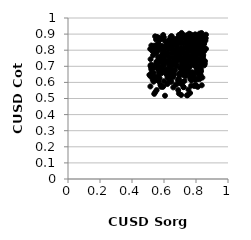
| Category | Series 0 |
|---|---|
| 0.5457226578914693 | 0.803 |
| 0.5820415566814895 | 0.742 |
| 0.6574451764975326 | 0.66 |
| 0.6752550594382059 | 0.869 |
| 0.7130549381380016 | 0.871 |
| 0.5505754176995341 | 0.783 |
| 0.7488513275881186 | 0.678 |
| 0.8416256582278505 | 0.766 |
| 0.723683260445533 | 0.812 |
| 0.7935257288644972 | 0.796 |
| 0.693018027354305 | 0.773 |
| 0.784467930927218 | 0.633 |
| 0.8117410290243743 | 0.855 |
| 0.6580849766439321 | 0.569 |
| 0.7692660674586399 | 0.764 |
| 0.6405592007420011 | 0.656 |
| 0.7277209901649628 | 0.609 |
| 0.7744196884114483 | 0.663 |
| 0.668613444816808 | 0.847 |
| 0.7392412906544054 | 0.71 |
| 0.689508161379329 | 0.594 |
| 0.731924884660142 | 0.868 |
| 0.8248937572480575 | 0.65 |
| 0.5148524658414562 | 0.575 |
| 0.5641696275729025 | 0.84 |
| 0.8037513007634838 | 0.578 |
| 0.7483759412593186 | 0.684 |
| 0.5663074692521712 | 0.694 |
| 0.5499941879436182 | 0.791 |
| 0.7121200630051845 | 0.712 |
| 0.7058212405791672 | 0.814 |
| 0.5937035099978996 | 0.717 |
| 0.8291260168941896 | 0.673 |
| 0.5570148817277782 | 0.882 |
| 0.7141468487834657 | 0.694 |
| 0.6580584887409366 | 0.633 |
| 0.6399307540311069 | 0.88 |
| 0.6925681058426278 | 0.877 |
| 0.7614702906040478 | 0.661 |
| 0.5578501910818092 | 0.728 |
| 0.5394427603922205 | 0.805 |
| 0.7743932370819626 | 0.647 |
| 0.7220183729899539 | 0.84 |
| 0.5455888965109581 | 0.54 |
| 0.7817488615426387 | 0.727 |
| 0.8150313525948676 | 0.652 |
| 0.5501655988925712 | 0.867 |
| 0.5779119782322806 | 0.806 |
| 0.8177974553196619 | 0.736 |
| 0.7369173507866649 | 0.764 |
| 0.5996876197299047 | 0.82 |
| 0.8232861234015729 | 0.691 |
| 0.5421583549383685 | 0.633 |
| 0.8203063983397311 | 0.628 |
| 0.7432944801690256 | 0.52 |
| 0.8026722654339411 | 0.747 |
| 0.7324021082682642 | 0.758 |
| 0.8232832348045411 | 0.829 |
| 0.5556463949286581 | 0.88 |
| 0.7620896380337474 | 0.705 |
| 0.6223724156518007 | 0.809 |
| 0.6401315556109933 | 0.829 |
| 0.8311983168125705 | 0.669 |
| 0.6127117955059027 | 0.823 |
| 0.6096722874639363 | 0.773 |
| 0.571638113350313 | 0.807 |
| 0.8207566657600132 | 0.862 |
| 0.6554024281387867 | 0.839 |
| 0.5907336533650455 | 0.876 |
| 0.6015353490839019 | 0.775 |
| 0.7043214704565222 | 0.754 |
| 0.7778187052440948 | 0.724 |
| 0.589962655403742 | 0.776 |
| 0.6125058261240378 | 0.826 |
| 0.6810460499648323 | 0.773 |
| 0.5351386777890065 | 0.604 |
| 0.7046044673771751 | 0.739 |
| 0.8560215062351673 | 0.732 |
| 0.8112118226193524 | 0.572 |
| 0.7696481851082584 | 0.579 |
| 0.73460007247253 | 0.646 |
| 0.8223389512555741 | 0.877 |
| 0.8090318014074852 | 0.619 |
| 0.7556542803738591 | 0.662 |
| 0.7200901535938342 | 0.754 |
| 0.6028327518208085 | 0.709 |
| 0.6498979735421571 | 0.804 |
| 0.8286975612409831 | 0.647 |
| 0.6349791255831567 | 0.64 |
| 0.8113693694834748 | 0.866 |
| 0.6089561161708308 | 0.726 |
| 0.8064496722266732 | 0.743 |
| 0.8414270815792777 | 0.836 |
| 0.5948114404613527 | 0.894 |
| 0.8351740172883895 | 0.749 |
| 0.8470185200196598 | 0.809 |
| 0.5286461403371234 | 0.793 |
| 0.836226499715456 | 0.77 |
| 0.7889180925463773 | 0.755 |
| 0.6964362518172005 | 0.742 |
| 0.704740798943889 | 0.753 |
| 0.6874071028220665 | 0.785 |
| 0.6327013951077701 | 0.713 |
| 0.6667462719494607 | 0.728 |
| 0.7718375700217853 | 0.799 |
| 0.5855870259741989 | 0.676 |
| 0.5994315803905712 | 0.88 |
| 0.6686731617542627 | 0.677 |
| 0.7056628581224103 | 0.684 |
| 0.8226938736839762 | 0.62 |
| 0.7991582025080584 | 0.758 |
| 0.6792116834227808 | 0.711 |
| 0.6097799660327874 | 0.853 |
| 0.7067010526190458 | 0.851 |
| 0.7880500071993324 | 0.817 |
| 0.6070274973598637 | 0.766 |
| 0.6797144303513258 | 0.731 |
| 0.8060280911832491 | 0.839 |
| 0.5944923998553302 | 0.573 |
| 0.7055036387190643 | 0.605 |
| 0.5167144154654271 | 0.636 |
| 0.7684431915546811 | 0.898 |
| 0.8301815004301825 | 0.685 |
| 0.7358644083941208 | 0.703 |
| 0.6355770242712496 | 0.864 |
| 0.5998937174973021 | 0.739 |
| 0.6610690526595713 | 0.804 |
| 0.5443224519067439 | 0.886 |
| 0.8250639963311653 | 0.669 |
| 0.6343441347901457 | 0.714 |
| 0.8542204190350994 | 0.719 |
| 0.8009249630894547 | 0.781 |
| 0.701712464511115 | 0.692 |
| 0.5968407545011762 | 0.866 |
| 0.8092134369510031 | 0.665 |
| 0.7751363434336973 | 0.84 |
| 0.7703977460090834 | 0.738 |
| 0.602412143621385 | 0.751 |
| 0.7293454715185994 | 0.712 |
| 0.7326885663684408 | 0.72 |
| 0.8519527553697637 | 0.706 |
| 0.74429664049625 | 0.811 |
| 0.6589718991559934 | 0.734 |
| 0.6074626190114201 | 0.73 |
| 0.7303092911457154 | 0.667 |
| 0.5316798145948454 | 0.769 |
| 0.8498805345270116 | 0.808 |
| 0.7037756386627636 | 0.662 |
| 0.6279858290744565 | 0.674 |
| 0.6306680831892935 | 0.732 |
| 0.7923426204302795 | 0.771 |
| 0.5783801617728314 | 0.728 |
| 0.8329304098219796 | 0.71 |
| 0.7157899061074547 | 0.707 |
| 0.6941806884987283 | 0.654 |
| 0.8140350888670429 | 0.848 |
| 0.7528574969121704 | 0.729 |
| 0.7289511681770138 | 0.706 |
| 0.6975802560361317 | 0.744 |
| 0.6545090825566181 | 0.861 |
| 0.5300046211152594 | 0.615 |
| 0.569470798504409 | 0.876 |
| 0.7923019704914944 | 0.706 |
| 0.7821448947220843 | 0.803 |
| 0.8240041782040589 | 0.648 |
| 0.6335262740235029 | 0.743 |
| 0.5382240039686249 | 0.779 |
| 0.7232030528612523 | 0.811 |
| 0.8398929430815486 | 0.63 |
| 0.6221200860546816 | 0.818 |
| 0.756617127246918 | 0.831 |
| 0.5619085718854187 | 0.806 |
| 0.6217228319325869 | 0.633 |
| 0.7891260018829774 | 0.578 |
| 0.7090840532613476 | 0.78 |
| 0.7295319007173267 | 0.787 |
| 0.5199076824365112 | 0.71 |
| 0.6633647408142589 | 0.843 |
| 0.7012200201920786 | 0.754 |
| 0.738580813105093 | 0.737 |
| 0.6181598579368397 | 0.731 |
| 0.5682464536808958 | 0.827 |
| 0.8208228289320129 | 0.69 |
| 0.8128115952784443 | 0.875 |
| 0.7990016938769943 | 0.859 |
| 0.7859702391100623 | 0.727 |
| 0.5933946993905561 | 0.704 |
| 0.5246550163250101 | 0.657 |
| 0.8504443894310971 | 0.838 |
| 0.717387376320967 | 0.797 |
| 0.5925338079033657 | 0.574 |
| 0.6544395240370471 | 0.754 |
| 0.7444861998617047 | 0.788 |
| 0.6062955457466427 | 0.517 |
| 0.8227783438375249 | 0.775 |
| 0.8115050081394497 | 0.801 |
| 0.639344223111258 | 0.693 |
| 0.6884022729648416 | 0.874 |
| 0.7932472437931712 | 0.871 |
| 0.6936436006363742 | 0.895 |
| 0.7351775159769071 | 0.739 |
| 0.6458138273778244 | 0.604 |
| 0.6795080404202227 | 0.836 |
| 0.7215914135102182 | 0.726 |
| 0.6932193575462688 | 0.531 |
| 0.6368434859051253 | 0.642 |
| 0.514160042493545 | 0.808 |
| 0.6576041158151178 | 0.723 |
| 0.7621335626045096 | 0.855 |
| 0.6508112078117776 | 0.781 |
| 0.8160065613895429 | 0.658 |
| 0.7100015617056175 | 0.812 |
| 0.7337705860979025 | 0.776 |
| 0.780740160797371 | 0.726 |
| 0.6907962252388742 | 0.786 |
| 0.6647489516856484 | 0.791 |
| 0.5086555845352292 | 0.646 |
| 0.5357004068542792 | 0.827 |
| 0.7504082187276574 | 0.697 |
| 0.7674915398347391 | 0.617 |
| 0.7636605590644167 | 0.625 |
| 0.6737516958858087 | 0.774 |
| 0.6767633985221474 | 0.7 |
| 0.518940205423245 | 0.698 |
| 0.5872910299345999 | 0.826 |
| 0.6963021674334908 | 0.895 |
| 0.5832067026063025 | 0.656 |
| 0.6030994791616044 | 0.814 |
| 0.5734271380362364 | 0.812 |
| 0.7859343229689043 | 0.657 |
| 0.7952599979824492 | 0.832 |
| 0.7629079511370483 | 0.534 |
| 0.5339597305756433 | 0.791 |
| 0.6394139486975694 | 0.836 |
| 0.6206743735486271 | 0.779 |
| 0.704649081712923 | 0.785 |
| 0.784640023093506 | 0.642 |
| 0.7966208826865359 | 0.586 |
| 0.7731501131860025 | 0.839 |
| 0.7709158109155311 | 0.885 |
| 0.7275372221889764 | 0.672 |
| 0.6728059831532607 | 0.764 |
| 0.7489849105715798 | 0.743 |
| 0.5991716594737471 | 0.805 |
| 0.6140034713718365 | 0.668 |
| 0.5729350254615874 | 0.626 |
| 0.7809462646204444 | 0.78 |
| 0.6131688486460309 | 0.653 |
| 0.5541262416540156 | 0.552 |
| 0.7590754828616135 | 0.735 |
| 0.7686598181268046 | 0.867 |
| 0.6145284328812132 | 0.654 |
| 0.5649471984021953 | 0.758 |
| 0.8154574342041097 | 0.804 |
| 0.7598321685517213 | 0.835 |
| 0.8024852557121498 | 0.694 |
| 0.7512012070861279 | 0.768 |
| 0.8484403197536137 | 0.859 |
| 0.8381324836891018 | 0.79 |
| 0.7902770328779133 | 0.76 |
| 0.8055053134197745 | 0.823 |
| 0.7573843003489542 | 0.903 |
| 0.7946716083134628 | 0.801 |
| 0.6563218226363332 | 0.674 |
| 0.7367507521972351 | 0.751 |
| 0.562991837771626 | 0.804 |
| 0.6377966499974312 | 0.753 |
| 0.534723215199524 | 0.659 |
| 0.8430780405204346 | 0.754 |
| 0.6146173753745332 | 0.848 |
| 0.8487587485391697 | 0.794 |
| 0.5388189035339608 | 0.807 |
| 0.7863585402357585 | 0.765 |
| 0.5484373544758774 | 0.83 |
| 0.8276881254261959 | 0.9 |
| 0.6261683226153498 | 0.762 |
| 0.5819251264557938 | 0.757 |
| 0.639377260748907 | 0.838 |
| 0.7419219571911421 | 0.893 |
| 0.6345557596136235 | 0.816 |
| 0.6209920211432634 | 0.59 |
| 0.8164304735037569 | 0.748 |
| 0.7052827385138507 | 0.842 |
| 0.8184236083612763 | 0.802 |
| 0.6857459586856993 | 0.78 |
| 0.5725995342829608 | 0.725 |
| 0.7484029003236523 | 0.693 |
| 0.7030485930250077 | 0.809 |
| 0.5347649882319792 | 0.69 |
| 0.83884792687884 | 0.764 |
| 0.7345890803913315 | 0.639 |
| 0.7226641959422739 | 0.571 |
| 0.7853798380852879 | 0.873 |
| 0.6067636700595906 | 0.735 |
| 0.7185031711311807 | 0.647 |
| 0.7515986636866785 | 0.811 |
| 0.7564218031383423 | 0.793 |
| 0.748161755578695 | 0.521 |
| 0.7202545400793892 | 0.895 |
| 0.5765384960217534 | 0.693 |
| 0.7893576199131072 | 0.807 |
| 0.704768664331455 | 0.848 |
| 0.6482495891239841 | 0.647 |
| 0.8219265795129762 | 0.812 |
| 0.7222598622249133 | 0.571 |
| 0.5881596806969869 | 0.758 |
| 0.6270958874658681 | 0.857 |
| 0.788833704724099 | 0.873 |
| 0.7386394748302694 | 0.857 |
| 0.8607986164784189 | 0.875 |
| 0.5471126083638143 | 0.712 |
| 0.7329926062301941 | 0.682 |
| 0.687914211849169 | 0.806 |
| 0.6859344851542606 | 0.764 |
| 0.7072568770247014 | 0.522 |
| 0.7524439383659012 | 0.555 |
| 0.595269876609414 | 0.702 |
| 0.648290209828648 | 0.782 |
| 0.8515110039284193 | 0.847 |
| 0.8221107040927301 | 0.748 |
| 0.632431793162139 | 0.605 |
| 0.5502608873071357 | 0.794 |
| 0.8086103625012645 | 0.802 |
| 0.7126590128747636 | 0.588 |
| 0.5776132802893417 | 0.585 |
| 0.6125268138490501 | 0.823 |
| 0.5460114812361078 | 0.615 |
| 0.7415865172290823 | 0.831 |
| 0.7276898966704057 | 0.76 |
| 0.756072999874384 | 0.797 |
| 0.6848773386886298 | 0.842 |
| 0.8623340319744193 | 0.896 |
| 0.8288662566513342 | 0.713 |
| 0.6862774990478859 | 0.614 |
| 0.5233252085184212 | 0.662 |
| 0.8384968472326244 | 0.73 |
| 0.6641857316615347 | 0.833 |
| 0.7517861152247981 | 0.878 |
| 0.8551685982709638 | 0.863 |
| 0.5619667239534007 | 0.702 |
| 0.5490399125217993 | 0.821 |
| 0.5877374580250732 | 0.691 |
| 0.6724643111528634 | 0.584 |
| 0.6878997740774873 | 0.798 |
| 0.8067732555838519 | 0.748 |
| 0.7785102826935196 | 0.79 |
| 0.6530151640653311 | 0.815 |
| 0.7322183510233999 | 0.76 |
| 0.8437507226855188 | 0.879 |
| 0.8031920071403675 | 0.711 |
| 0.7734615877287252 | 0.613 |
| 0.5949257550737546 | 0.711 |
| 0.8452284166749936 | 0.771 |
| 0.6564466462804686 | 0.708 |
| 0.7951505244677036 | 0.738 |
| 0.7771679580959236 | 0.719 |
| 0.803768960878066 | 0.679 |
| 0.7815326463132889 | 0.849 |
| 0.5205654076008717 | 0.682 |
| 0.6975652826195327 | 0.644 |
| 0.8237630451235914 | 0.736 |
| 0.7609557866189458 | 0.899 |
| 0.7728266927948604 | 0.816 |
| 0.8358456183676253 | 0.582 |
| 0.6947044286476958 | 0.779 |
| 0.7230436636853336 | 0.847 |
| 0.542821673912655 | 0.632 |
| 0.5455983620161731 | 0.798 |
| 0.8270981264145092 | 0.781 |
| 0.7886069924165007 | 0.719 |
| 0.8048194589147859 | 0.833 |
| 0.7100019668733535 | 0.907 |
| 0.8332790626734656 | 0.716 |
| 0.6371612079947522 | 0.681 |
| 0.6981213424816672 | 0.751 |
| 0.6004887362548237 | 0.607 |
| 0.5948681329729582 | 0.785 |
| 0.7945386025153928 | 0.899 |
| 0.6038277636597874 | 0.788 |
| 0.5161646932606971 | 0.744 |
| 0.7642852394485605 | 0.875 |
| 0.6812570315621067 | 0.745 |
| 0.5636195302312045 | 0.633 |
| 0.5988894712729851 | 0.78 |
| 0.8441713856480073 | 0.727 |
| 0.8277555170974579 | 0.812 |
| 0.8317397841537575 | 0.778 |
| 0.7730419946070501 | 0.714 |
| 0.5733308637842992 | 0.863 |
| 0.8080409108130819 | 0.891 |
| 0.8127897579538365 | 0.793 |
| 0.6608917135635834 | 0.667 |
| 0.7668192420988535 | 0.639 |
| 0.7326467273542978 | 0.88 |
| 0.6894780925548636 | 0.778 |
| 0.6256431335432211 | 0.725 |
| 0.6830829956703457 | 0.785 |
| 0.7227681175314169 | 0.671 |
| 0.5152761588656892 | 0.704 |
| 0.805014000849079 | 0.728 |
| 0.6243712618881774 | 0.781 |
| 0.6576707187331309 | 0.86 |
| 0.8003866148181742 | 0.697 |
| 0.8214052574608272 | 0.903 |
| 0.6692738375777351 | 0.75 |
| 0.7180494660637713 | 0.712 |
| 0.8417731855894902 | 0.76 |
| 0.7479666085831242 | 0.81 |
| 0.797407691792362 | 0.741 |
| 0.5209554661811718 | 0.829 |
| 0.568766243100582 | 0.663 |
| 0.7679479439605994 | 0.846 |
| 0.6442964152067754 | 0.721 |
| 0.6343175806399476 | 0.697 |
| 0.8207034948200621 | 0.74 |
| 0.8625264830718247 | 0.808 |
| 0.6030922292378592 | 0.677 |
| 0.8460924823271722 | 0.737 |
| 0.7583960775258465 | 0.856 |
| 0.6839322880085776 | 0.842 |
| 0.6743234998418219 | 0.808 |
| 0.538954734360251 | 0.529 |
| 0.5692681559365471 | 0.814 |
| 0.7221161839395289 | 0.724 |
| 0.5645242346989107 | 0.754 |
| 0.564062247615388 | 0.642 |
| 0.7635927402921954 | 0.699 |
| 0.6067874550017356 | 0.73 |
| 0.6858620669372756 | 0.856 |
| 0.6794580035734124 | 0.828 |
| 0.5657684694025548 | 0.799 |
| 0.6627981882669833 | 0.648 |
| 0.8256910719862036 | 0.818 |
| 0.5989001749749809 | 0.678 |
| 0.7986508226294127 | 0.771 |
| 0.6456223234780167 | 0.67 |
| 0.8204601310790988 | 0.842 |
| 0.8093472589968301 | 0.672 |
| 0.5606487086831963 | 0.683 |
| 0.85314540720767 | 0.713 |
| 0.563982392568027 | 0.839 |
| 0.6446193186307855 | 0.856 |
| 0.8509242326432214 | 0.795 |
| 0.8480386475083374 | 0.8 |
| 0.5826157152860048 | 0.572 |
| 0.8135316942410126 | 0.779 |
| 0.8587725403675055 | 0.859 |
| 0.5660907290996755 | 0.7 |
| 0.8091661698732484 | 0.695 |
| 0.6923408732149952 | 0.625 |
| 0.7141274026822801 | 0.704 |
| 0.5869258148793042 | 0.765 |
| 0.5289339604368046 | 0.637 |
| 0.5530213752237473 | 0.729 |
| 0.7750162632923847 | 0.857 |
| 0.6068182100727741 | 0.767 |
| 0.8208079241394503 | 0.815 |
| 0.6721725916498051 | 0.788 |
| 0.7339093187652994 | 0.777 |
| 0.7963330858318869 | 0.815 |
| 0.8236703851280207 | 0.86 |
| 0.7660062553136326 | 0.65 |
| 0.7952891356952123 | 0.617 |
| 0.616500215084469 | 0.68 |
| 0.5669306638765448 | 0.607 |
| 0.7508407896840169 | 0.756 |
| 0.8547684890947671 | 0.889 |
| 0.6692511042509663 | 0.788 |
| 0.8278311251026046 | 0.811 |
| 0.6270877386633977 | 0.626 |
| 0.6428706470037526 | 0.634 |
| 0.6390007689024498 | 0.726 |
| 0.6821036136781995 | 0.791 |
| 0.8342446762905811 | 0.907 |
| 0.5889480376004621 | 0.807 |
| 0.6350696125656192 | 0.807 |
| 0.8036715498508952 | 0.623 |
| 0.8262761779174975 | 0.815 |
| 0.7139217201681605 | 0.721 |
| 0.561544528410237 | 0.833 |
| 0.5208693847886294 | 0.692 |
| 0.7440762348824328 | 0.701 |
| 0.8356363368667863 | 0.803 |
| 0.643667801135827 | 0.631 |
| 0.844204745435094 | 0.828 |
| 0.8363012716675765 | 0.831 |
| 0.815700625246143 | 0.79 |
| 0.7755844416859905 | 0.747 |
| 0.7504536177301138 | 0.693 |
| 0.7359931333898126 | 0.784 |
| 0.7512955853304144 | 0.847 |
| 0.7707794230699487 | 0.753 |
| 0.7423476848670729 | 0.831 |
| 0.6402986486824354 | 0.606 |
| 0.7524720671889205 | 0.734 |
| 0.652160844586112 | 0.88 |
| 0.6433733865118858 | 0.686 |
| 0.6466018636962972 | 0.888 |
| 0.8355596132039821 | 0.889 |
| 0.6887997228145153 | 0.553 |